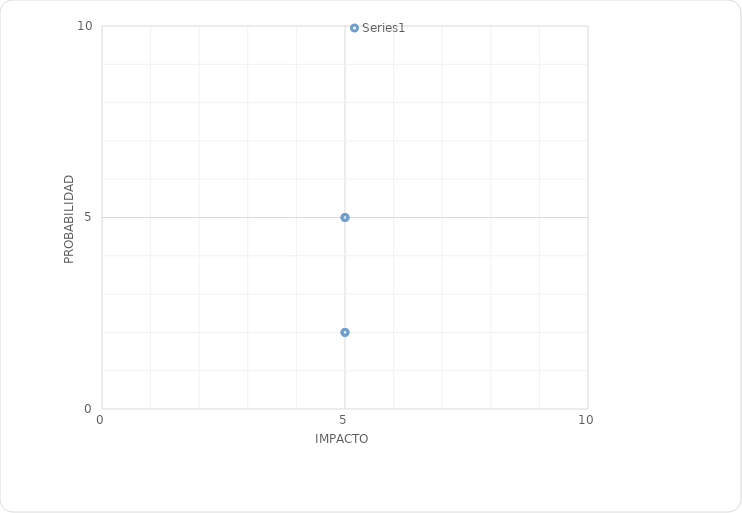
| Category | Series 0 |
|---|---|
| 5.0 | 5 |
| 5.0 | 5 |
| 5.0 | 2 |
| 5.0 | 2 |